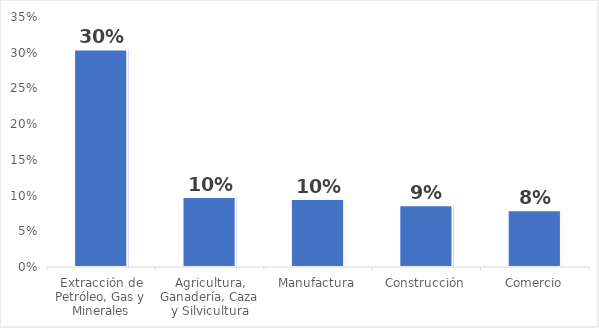
| Category | Series 0 |
|---|---|
| Extracción de Petróleo, Gas y Minerales | 0.305 |
| Agricultura, Ganadería, Caza y Silvicultura | 0.098 |
| Manufactura | 0.095 |
| Construcción | 0.086 |
| Comercio | 0.08 |